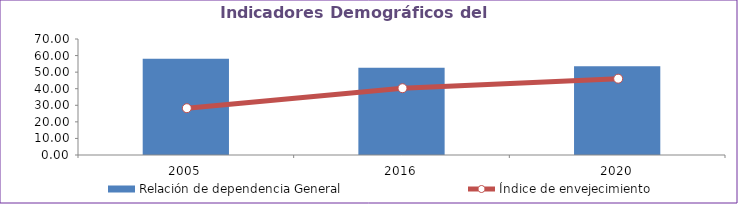
| Category | Relación de dependencia General |
|---|---|
| 2005.0 | 58.119 |
| 2016.0 | 52.643 |
| 2020.0 | 53.49 |